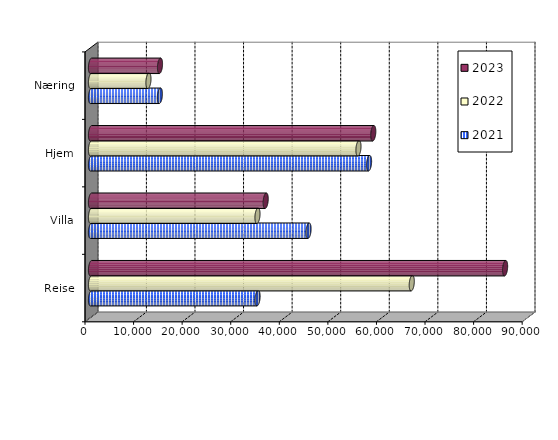
| Category | 2021 | 2022 | 2023 |
|---|---|---|---|
| Reise | 34290.494 | 66033.365 | 85249 |
| Villa | 44786.945 | 34271.79 | 35963.895 |
| Hjem | 57244.673 | 55060.822 | 58109 |
| Næring | 14184.868 | 11825.086 | 14204.682 |